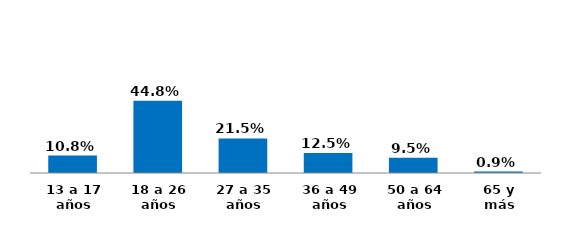
| Category | Series 0 |
|---|---|
| 13 a 17 años | 0.108 |
| 18 a 26 años | 0.448 |
| 27 a 35 años | 0.215 |
| 36 a 49 años | 0.125 |
| 50 a 64 años | 0.095 |
| 65 y más | 0.009 |